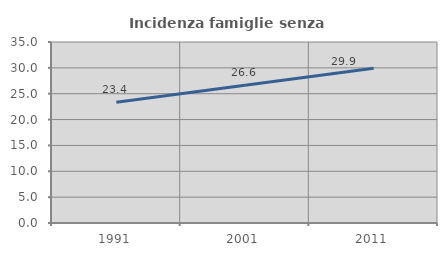
| Category | Incidenza famiglie senza nuclei |
|---|---|
| 1991.0 | 23.368 |
| 2001.0 | 26.642 |
| 2011.0 | 29.924 |